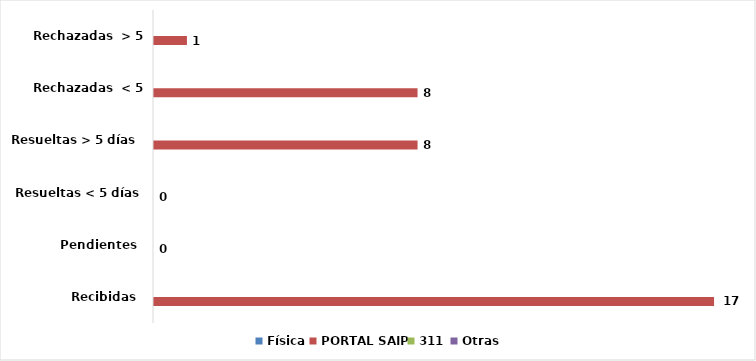
| Category | Física | PORTAL SAIP | 311 | Otras |
|---|---|---|---|---|
| Recibidas  | 0 | 17 | 0 | 0 |
| Pendientes  | 0 | 0 | 0 | 0 |
| Resueltas < 5 días | 0 | 0 | 0 | 0 |
| Resueltas > 5 días  | 0 | 8 | 0 | 0 |
| Rechazadas  < 5 días | 0 | 8 | 0 | 0 |
| Rechazadas  > 5 días | 0 | 1 | 0 | 0 |